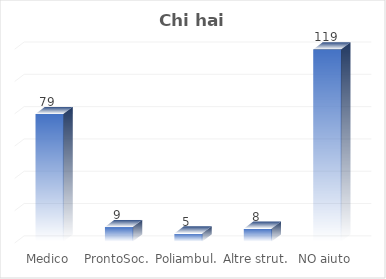
| Category | Chi hai chiamato? |
|---|---|
| Medico | 79 |
| ProntoSoc. | 9 |
| Poliambul. | 5 |
| Altre strut. | 8 |
| NO aiuto | 119 |